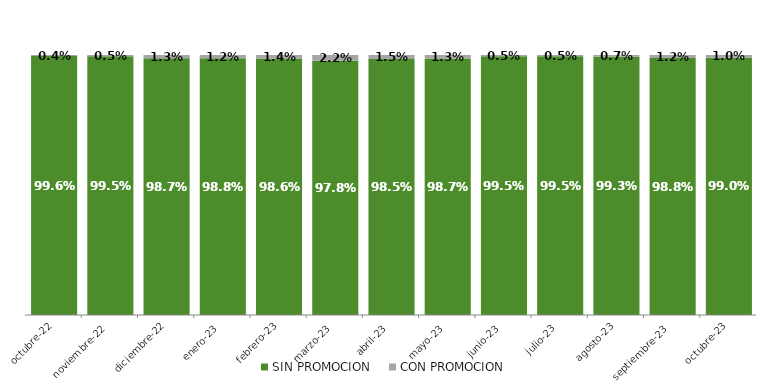
| Category | SIN PROMOCION   | CON PROMOCION   |
|---|---|---|
| 2022-10-01 | 0.996 | 0.004 |
| 2022-11-01 | 0.995 | 0.005 |
| 2022-12-01 | 0.987 | 0.013 |
| 2023-01-01 | 0.988 | 0.012 |
| 2023-02-01 | 0.986 | 0.014 |
| 2023-03-01 | 0.978 | 0.022 |
| 2023-04-01 | 0.985 | 0.015 |
| 2023-05-01 | 0.987 | 0.013 |
| 2023-06-01 | 0.995 | 0.005 |
| 2023-07-01 | 0.995 | 0.005 |
| 2023-08-01 | 0.993 | 0.007 |
| 2023-09-01 | 0.988 | 0.012 |
| 2023-10-01 | 0.99 | 0.01 |